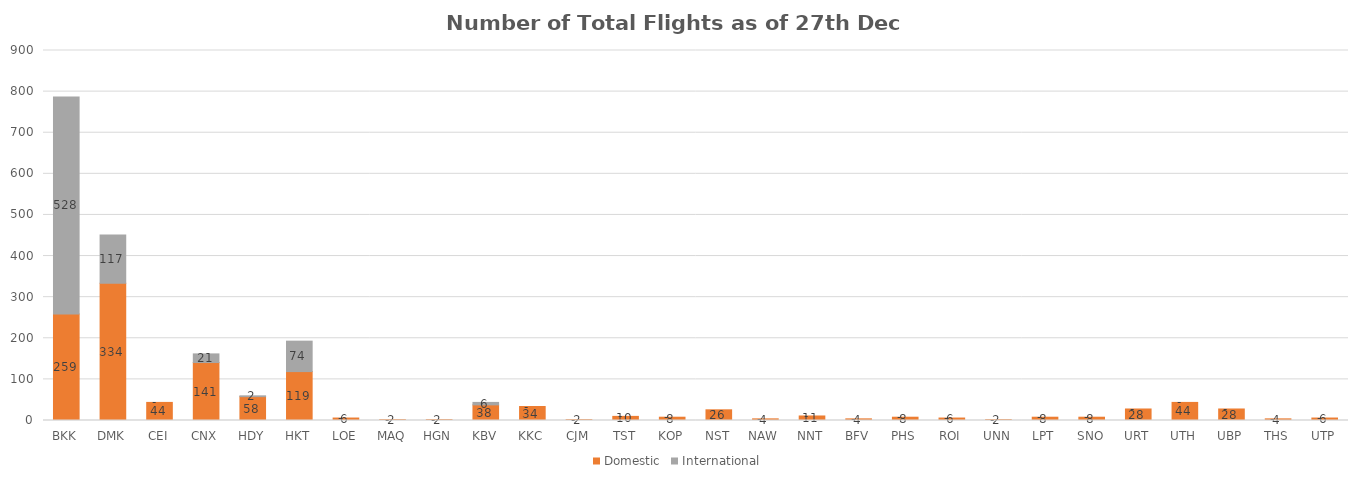
| Category | Domestic | International |
|---|---|---|
| BKK | 259 | 528 |
| DMK | 334 | 117 |
| CEI | 44 | 0 |
| CNX | 141 | 21 |
| HDY | 58 | 2 |
| HKT | 119 | 74 |
| LOE | 6 | 0 |
| MAQ | 2 | 0 |
| HGN | 2 | 0 |
| KBV | 38 | 6 |
| KKC | 34 | 0 |
| CJM | 2 | 0 |
| TST | 10 | 0 |
| KOP | 8 | 0 |
| NST | 26 | 0 |
| NAW | 4 | 0 |
| NNT | 11 | 0 |
| BFV | 4 | 0 |
| PHS | 8 | 0 |
| ROI | 6 | 0 |
| UNN | 2 | 0 |
| LPT | 8 | 0 |
| SNO | 8 | 0 |
| URT | 28 | 0 |
| UTH | 44 | 0 |
| UBP | 28 | 0 |
| THS | 4 | 0 |
| UTP | 6 | 0 |